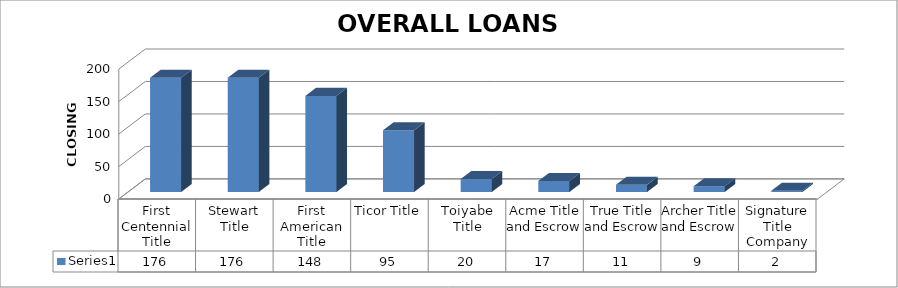
| Category | Series 0 |
|---|---|
| First Centennial Title | 176 |
| Stewart Title | 176 |
| First American Title | 148 |
| Ticor Title | 95 |
| Toiyabe Title | 20 |
| Acme Title and Escrow | 17 |
| True Title and Escrow | 11 |
| Archer Title and Escrow | 9 |
| Signature Title Company | 2 |